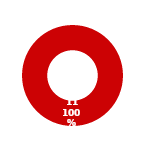
| Category | PROGRAM |
|---|---|
| MIL 2 Complete | 0 |
| MIL 2 Not Complete | 11 |